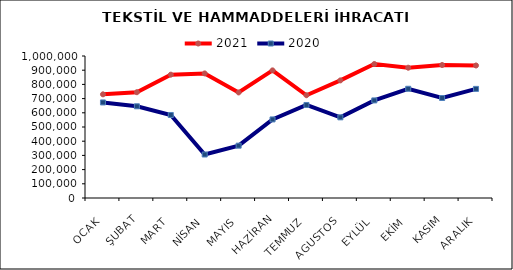
| Category | 2021 | 2020 |
|---|---|---|
| OCAK | 730138.837 | 672955.029 |
| ŞUBAT | 744960.176 | 645837.543 |
| MART | 868485.924 | 584623.762 |
| NİSAN | 877323.257 | 306241.665 |
| MAYIS | 743335.863 | 368572.659 |
| HAZİRAN | 898790.845 | 553315.372 |
| TEMMUZ | 723634.425 | 655112.703 |
| AGUSTOS | 828180.854 | 568016.626 |
| EYLÜL | 943612.555 | 687226.386 |
| EKİM | 917486.93 | 769155.727 |
| KASIM | 936663.268 | 704149.608 |
| ARALIK | 933218.579 | 768393.631 |